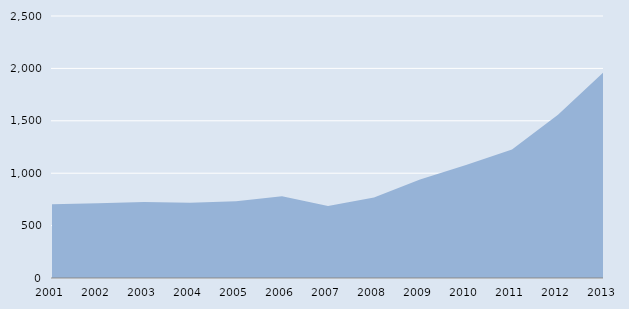
| Category | Series 0 |
|---|---|
| 2001.0 | 704 |
| 2002.0 | 713 |
| 2003.0 | 726 |
| 2004.0 | 718 |
| 2005.0 | 733 |
| 2006.0 | 779 |
| 2007.0 | 687 |
| 2008.0 | 769 |
| 2009.0 | 941 |
| 2010.0 | 1079 |
| 2011.0 | 1226 |
| 2012.0 | 1557 |
| 2013.0 | 1967 |